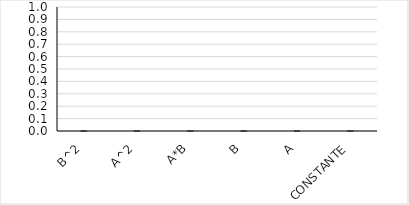
| Category | Series 0 |
|---|---|
| B^2 | 0 |
| A^2 | 0 |
|  A*B | 0 |
| B | 0 |
| A | 0 |
| CONSTANTE | 0 |